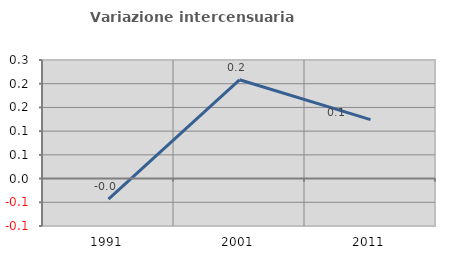
| Category | Variazione intercensuaria annua |
|---|---|
| 1991.0 | -0.043 |
| 2001.0 | 0.208 |
| 2011.0 | 0.124 |